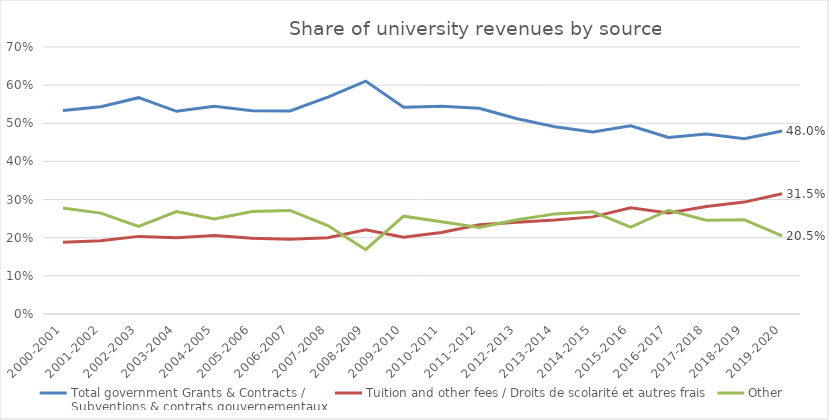
| Category | Total government Grants & Contracts / 
Subventions & contrats gouvernementaux | Tuition and other fees / Droits de scolarité et autres frais | Other |
|---|---|---|---|
| 2000-2001 | 0.534 | 0.188 | 0.278 |
| 2001-2002 | 0.544 | 0.192 | 0.264 |
| 2002-2003 | 0.567 | 0.203 | 0.229 |
| 2003-2004 | 0.531 | 0.2 | 0.269 |
| 2004-2005 | 0.545 | 0.206 | 0.249 |
| 2005-2006 | 0.533 | 0.198 | 0.269 |
| 2006-2007 | 0.532 | 0.196 | 0.272 |
| 2007-2008 | 0.568 | 0.2 | 0.232 |
| 2008-2009 | 0.611 | 0.221 | 0.169 |
| 2009-2010 | 0.542 | 0.201 | 0.257 |
| 2010-2011 | 0.544 | 0.214 | 0.242 |
| 2011-2012 | 0.539 | 0.234 | 0.227 |
| 2012-2013 | 0.512 | 0.241 | 0.247 |
| 2013-2014 | 0.491 | 0.247 | 0.262 |
| 2014-2015 | 0.477 | 0.255 | 0.268 |
| 2015-2016 | 0.494 | 0.279 | 0.228 |
| 2016-2017 | 0.463 | 0.265 | 0.272 |
| 2017-2018 | 0.472 | 0.282 | 0.246 |
| 2018-2019 | 0.459 | 0.293 | 0.247 |
| 2019-2020 | 0.48 | 0.315 | 0.205 |